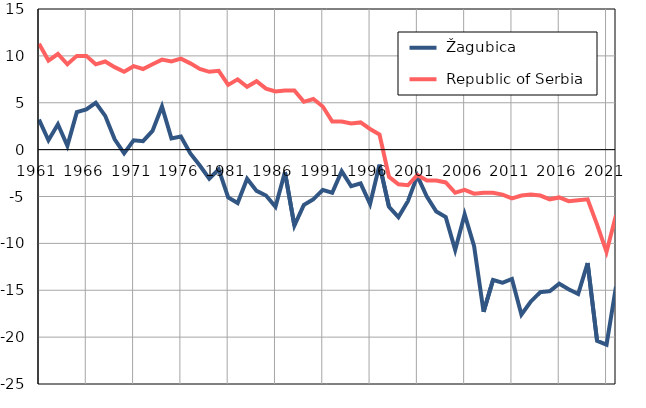
| Category |  Žagubica |  Republic of Serbia |
|---|---|---|
| 1961.0 | 3.2 | 11.3 |
| 1962.0 | 1 | 9.5 |
| 1963.0 | 2.7 | 10.2 |
| 1964.0 | 0.4 | 9.1 |
| 1965.0 | 4 | 10 |
| 1966.0 | 4.3 | 10 |
| 1967.0 | 5 | 9.1 |
| 1968.0 | 3.6 | 9.4 |
| 1969.0 | 1.1 | 8.8 |
| 1970.0 | -0.4 | 8.3 |
| 1971.0 | 1 | 8.9 |
| 1972.0 | 0.9 | 8.6 |
| 1973.0 | 2 | 9.1 |
| 1974.0 | 4.6 | 9.6 |
| 1975.0 | 1.2 | 9.4 |
| 1976.0 | 1.4 | 9.7 |
| 1977.0 | -0.4 | 9.2 |
| 1978.0 | -1.7 | 8.6 |
| 1979.0 | -3.1 | 8.3 |
| 1980.0 | -2.1 | 8.4 |
| 1981.0 | -5.1 | 6.9 |
| 1982.0 | -5.7 | 7.5 |
| 1983.0 | -3.1 | 6.7 |
| 1984.0 | -4.4 | 7.3 |
| 1985.0 | -4.9 | 6.5 |
| 1986.0 | -6.1 | 6.2 |
| 1987.0 | -2.4 | 6.3 |
| 1988.0 | -8.1 | 6.3 |
| 1989.0 | -5.9 | 5.1 |
| 1990.0 | -5.3 | 5.4 |
| 1991.0 | -4.3 | 4.6 |
| 1992.0 | -4.6 | 3 |
| 1993.0 | -2.3 | 3 |
| 1994.0 | -3.9 | 2.8 |
| 1995.0 | -3.6 | 2.9 |
| 1996.0 | -5.8 | 2.2 |
| 1997.0 | -1.6 | 1.6 |
| 1998.0 | -6.1 | -2.9 |
| 1999.0 | -7.2 | -3.7 |
| 2000.0 | -5.5 | -3.8 |
| 2001.0 | -2.8 | -2.7 |
| 2002.0 | -5 | -3.3 |
| 2003.0 | -6.6 | -3.3 |
| 2004.0 | -7.2 | -3.5 |
| 2005.0 | -10.7 | -4.6 |
| 2006.0 | -6.9 | -4.3 |
| 2007.0 | -10.3 | -4.7 |
| 2008.0 | -17.3 | -4.6 |
| 2009.0 | -13.9 | -4.6 |
| 2010.0 | -14.2 | -4.8 |
| 2011.0 | -13.8 | -5.2 |
| 2012.0 | -17.6 | -4.9 |
| 2013.0 | -16.2 | -4.8 |
| 2014.0 | -15.2 | -4.9 |
| 2015.0 | -15.1 | -5.3 |
| 2016.0 | -14.3 | -5.1 |
| 2017.0 | -14.9 | -5.5 |
| 2018.0 | -15.4 | -5.4 |
| 2019.0 | -12.1 | -5.3 |
| 2020.0 | -20.4 | -8 |
| 2021.0 | -20.8 | -10.9 |
| 2022.0 | -14.6 | -7 |